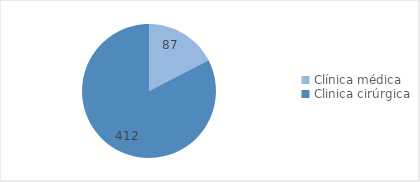
| Category | Series 0 |
|---|---|
| Clínica médica | 87 |
| Clinica cirúrgica | 412 |